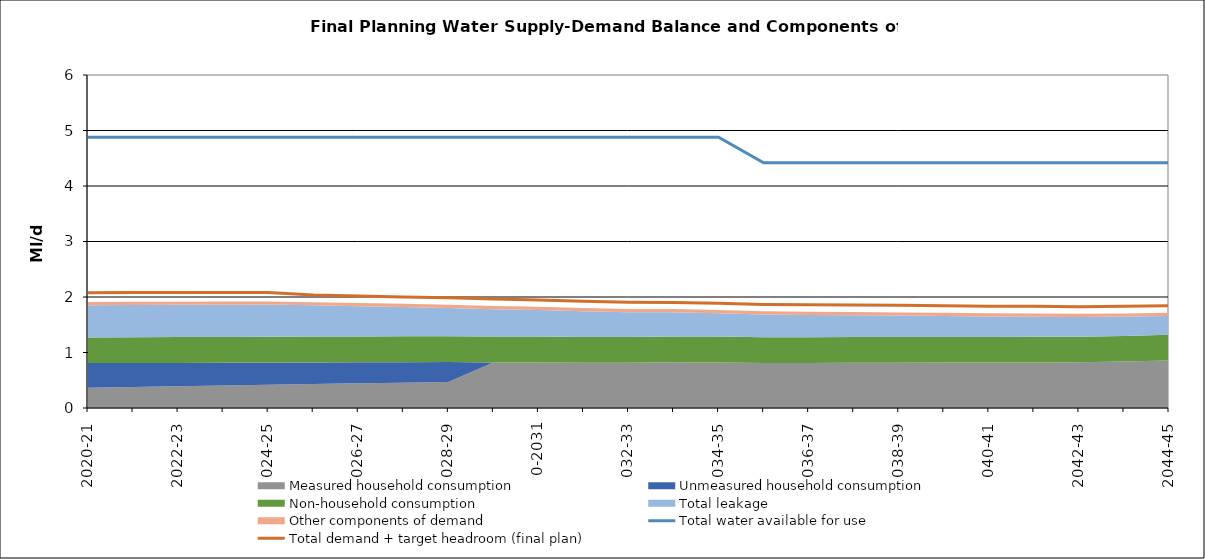
| Category | Total water available for use | Total demand + target headroom (final plan) |
|---|---|---|
| 0 | 4.88 | 2.077 |
| 1 | 4.88 | 2.082 |
| 2 | 4.88 | 2.082 |
| 3 | 4.88 | 2.083 |
| 4 | 4.88 | 2.081 |
| 5 | 4.88 | 2.034 |
| 6 | 4.88 | 2.017 |
| 7 | 4.88 | 2 |
| 8 | 4.88 | 1.984 |
| 9 | 4.88 | 1.962 |
| 10 | 4.88 | 1.947 |
| 11 | 4.88 | 1.922 |
| 12 | 4.88 | 1.905 |
| 13 | 4.88 | 1.902 |
| 14 | 4.88 | 1.887 |
| 15 | 4.42 | 1.866 |
| 16 | 4.42 | 1.861 |
| 17 | 4.42 | 1.855 |
| 18 | 4.42 | 1.85 |
| 19 | 4.42 | 1.84 |
| 20 | 4.42 | 1.835 |
| 21 | 4.42 | 1.832 |
| 22 | 4.42 | 1.826 |
| 23 | 4.42 | 1.832 |
| 24 | 4.42 | 1.843 |